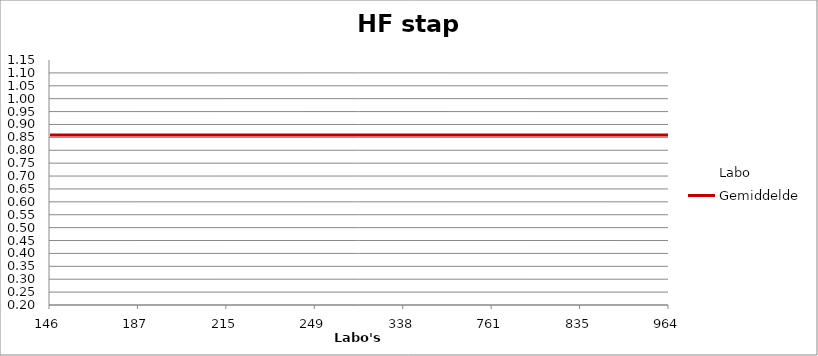
| Category | Labo | Gemiddelde |
|---|---|---|
| 146.0 | 0.214 | 0.859 |
| 187.0 | 0.917 | 0.859 |
| 215.0 | 1.116 | 0.859 |
| 249.0 | 0.749 | 0.859 |
| 338.0 | 0.745 | 0.859 |
| 761.0 | 0.871 | 0.859 |
| 835.0 | 0.961 | 0.859 |
| 964.0 | 0.932 | 0.859 |